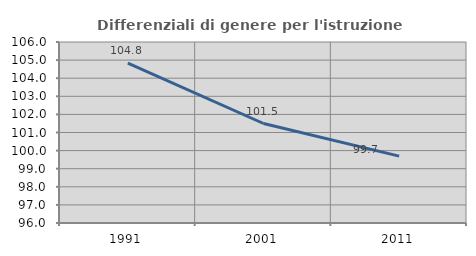
| Category | Differenziali di genere per l'istruzione superiore |
|---|---|
| 1991.0 | 104.826 |
| 2001.0 | 101.497 |
| 2011.0 | 99.697 |